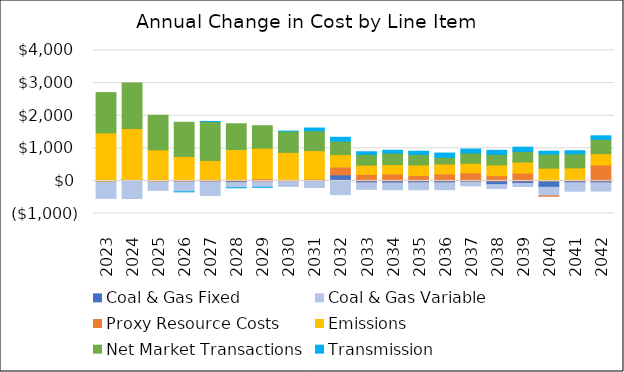
| Category | Coal & Gas Fixed | Coal & Gas Variable | Proxy Resource Costs | Emissions | Net Market Transactions | Transmission |
|---|---|---|---|---|---|---|
| 2023.0 | 0 | -537.326 | 7.886 | 1466.271 | 1233.797 | 0 |
| 2024.0 | 43.293 | -541.018 | 1.231 | 1565.898 | 1390.327 | 0 |
| 2025.0 | -13.724 | -278.289 | 7.245 | 945.221 | 1059.531 | 0 |
| 2026.0 | -24.993 | -308.928 | 28.218 | 722.613 | 1046.538 | -0.024 |
| 2027.0 | -25.347 | -420.765 | 38.473 | 588.241 | 1195.506 | 0 |
| 2028.0 | -50.802 | -158.876 | 32.808 | 930.089 | 790.033 | -0.006 |
| 2029.0 | -14.405 | -180.113 | 69.599 | 933.348 | 689.516 | -0.278 |
| 2030.0 | 6.588 | -170.481 | 14.397 | 853.455 | 646.649 | 1.971 |
| 2031.0 | 6.738 | -202.094 | 50.998 | 872.097 | 609.754 | 82.014 |
| 2032.0 | 185.418 | -419.651 | 240.52 | 381.955 | 409.932 | 120.647 |
| 2033.0 | -59.524 | -199.904 | 196.565 | 285.373 | 332.148 | 80.35 |
| 2034.0 | -66.37 | -203.455 | 213.874 | 287.905 | 354.813 | 83.163 |
| 2035.0 | -56.742 | -216.171 | 163.045 | 325.665 | 325.229 | 95.623 |
| 2036.0 | -59.283 | -210.194 | 210.499 | 306.958 | 204.485 | 131.68 |
| 2037.0 | -33.969 | -117.802 | 248.112 | 291.997 | 317.728 | 119.132 |
| 2038.0 | -112.68 | -119.432 | 160.127 | 332.582 | 320.852 | 124.328 |
| 2039.0 | -77.03 | -94.16 | 238.673 | 341.054 | 324.822 | 129.383 |
| 2040.0 | -196.894 | -263.806 | -9.437 | 390.504 | 434.46 | 85.352 |
| 2041.0 | -55.589 | -260.697 | 27.938 | 370.57 | 432.628 | 94.587 |
| 2042.0 | -56.857 | -255.273 | 488.615 | 346.747 | 440.726 | 107.196 |